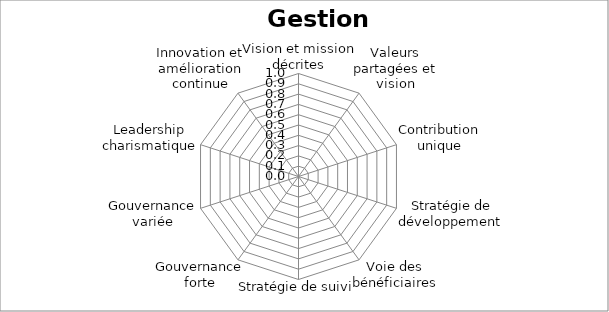
| Category | Series 0 |
|---|---|
| Vision et mission décrites | 0 |
| Valeurs partagées et vision | 0 |
| Contribution unique | 0 |
| Stratégie de développement  | 0 |
| Voie des bénéficiaires | 0 |
| Stratégie de suivi | 0 |
| Gouvernance forte | 0 |
| Gouvernance variée | 0 |
| Leadership charismatique | 0 |
| Innovation et amélioration continue | 0 |